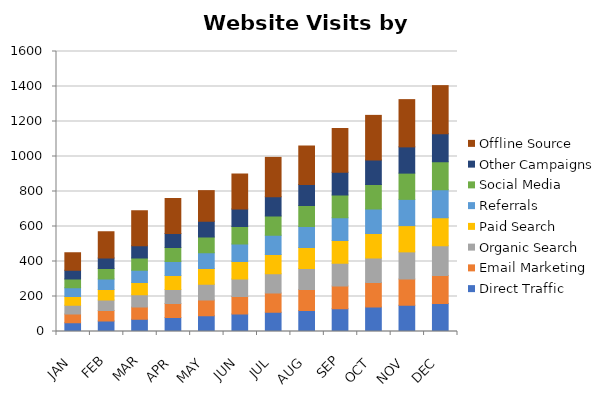
| Category | Direct Traffic | Email Marketing | Organic Search | Paid Search | Referrals | Social Media | Other Campaigns | Offline Source |
|---|---|---|---|---|---|---|---|---|
| JAN | 50 | 50 | 50 | 50 | 50 | 50 | 50 | 100 |
| FEB | 60 | 60 | 60 | 60 | 60 | 60 | 60 | 150 |
| MAR | 70 | 70 | 70 | 70 | 70 | 70 | 70 | 200 |
| APR | 80 | 80 | 80 | 80 | 80 | 80 | 80 | 200 |
| MAY | 90 | 90 | 90 | 90 | 90 | 90 | 90 | 175 |
| JUN | 100 | 100 | 100 | 100 | 100 | 100 | 100 | 200 |
| JUL | 110 | 110 | 110 | 110 | 110 | 110 | 110 | 225 |
| AUG | 120 | 120 | 120 | 120 | 120 | 120 | 120 | 220 |
| SEP | 130 | 130 | 130 | 130 | 130 | 130 | 130 | 250 |
| OCT | 140 | 140 | 140 | 140 | 140 | 140 | 140 | 255 |
| NOV | 150 | 150 | 155 | 150 | 150 | 150 | 150 | 270 |
| DEC | 160 | 160 | 170 | 160 | 160 | 160 | 160 | 275 |